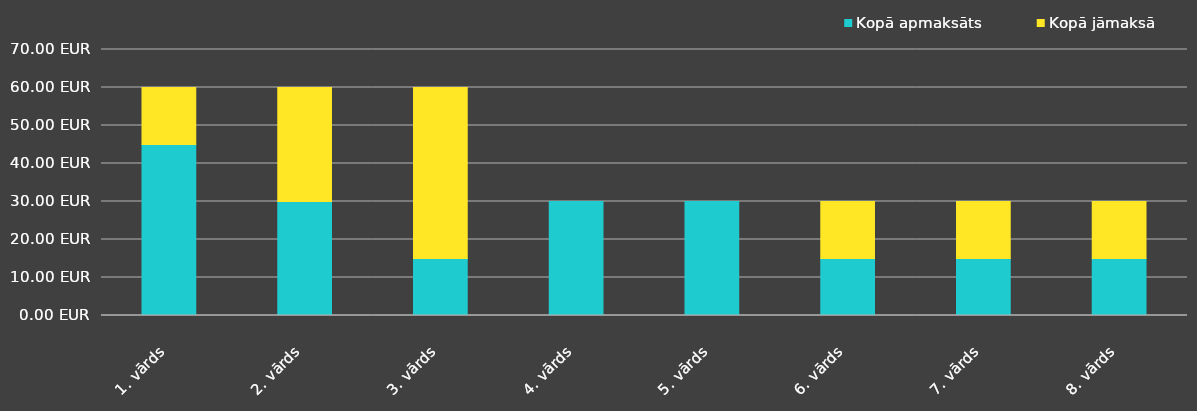
| Category | Kopā apmaksāts | Kopā jāmaksā |
|---|---|---|
| 1. vārds | 45 | 15 |
| 2. vārds | 30 | 30 |
| 3. vārds | 15 | 45 |
| 4. vārds | 30 | 0 |
| 5. vārds | 30 | 0 |
| 6. vārds | 15 | 15 |
| 7. vārds | 15 | 15 |
| 8. vārds | 15 | 15 |